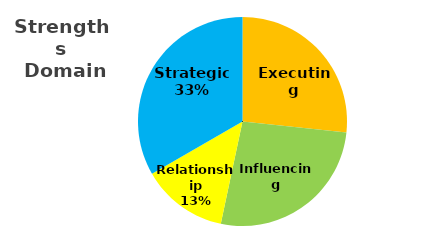
| Category | Series 0 |
|---|---|
| Executing | 0.267 |
| Influencing | 0.267 |
| Relationship | 0.133 |
| Strategic  | 0.333 |